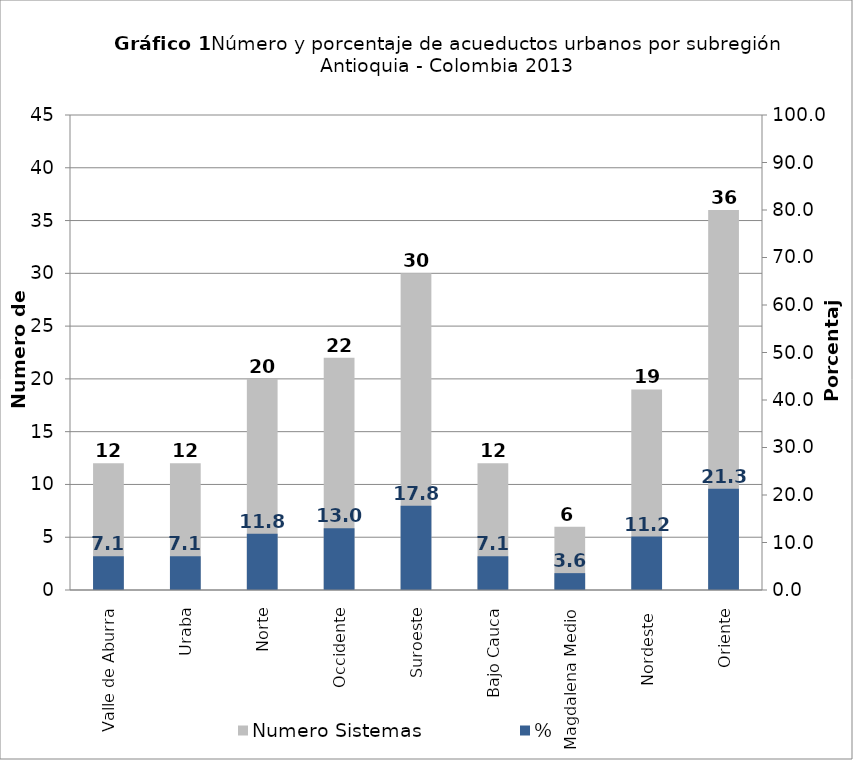
| Category | Numero Sistemas |
|---|---|
| Valle de Aburra | 12 |
| Uraba | 12 |
| Norte | 20 |
| Occidente | 22 |
| Suroeste | 30 |
| Bajo Cauca | 12 |
| Magdalena Medio | 6 |
| Nordeste  | 19 |
| Oriente | 36 |